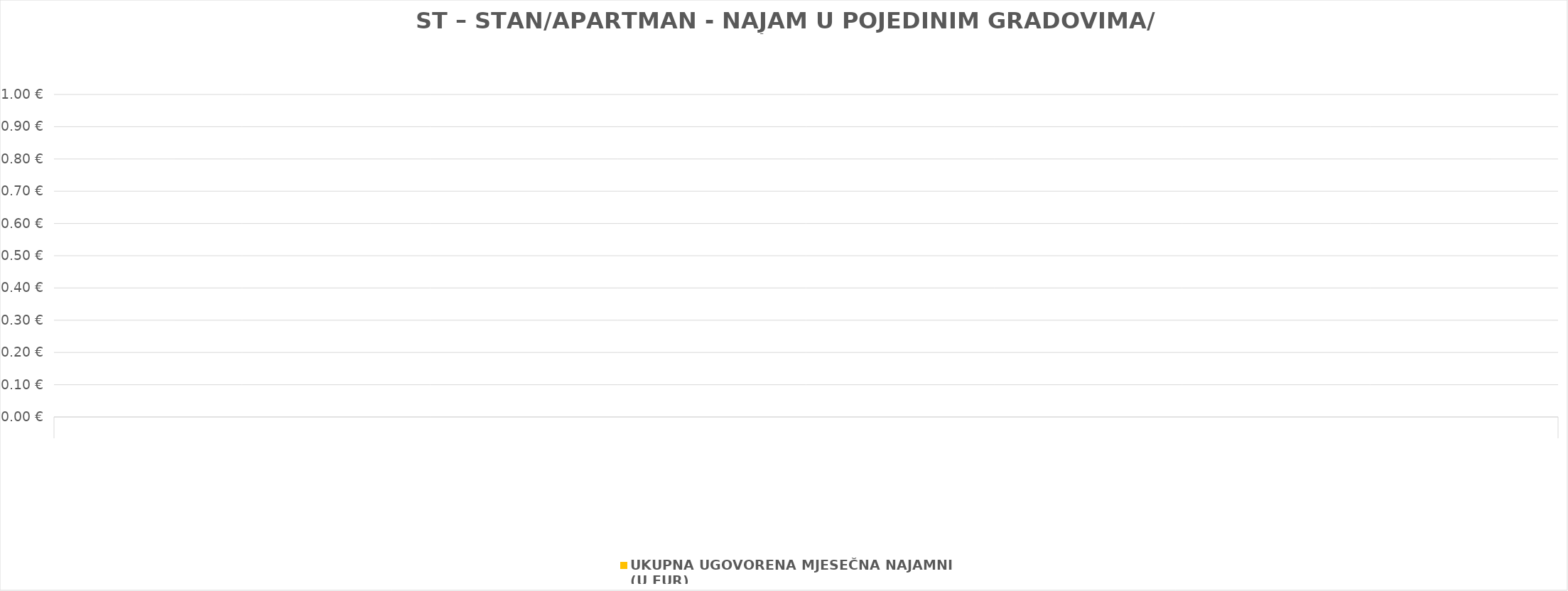
| Category | UKUPNA UGOVORENA MJESEČNA NAJAMNINA 
(U EUR) |
|---|---|
| 0 | 0 |
| 1 | 0 |